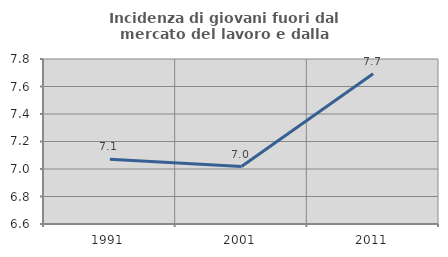
| Category | Incidenza di giovani fuori dal mercato del lavoro e dalla formazione  |
|---|---|
| 1991.0 | 7.071 |
| 2001.0 | 7.018 |
| 2011.0 | 7.692 |